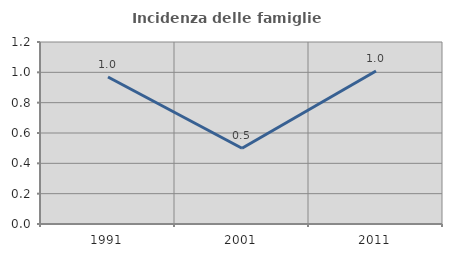
| Category | Incidenza delle famiglie numerose |
|---|---|
| 1991.0 | 0.969 |
| 2001.0 | 0.499 |
| 2011.0 | 1.009 |